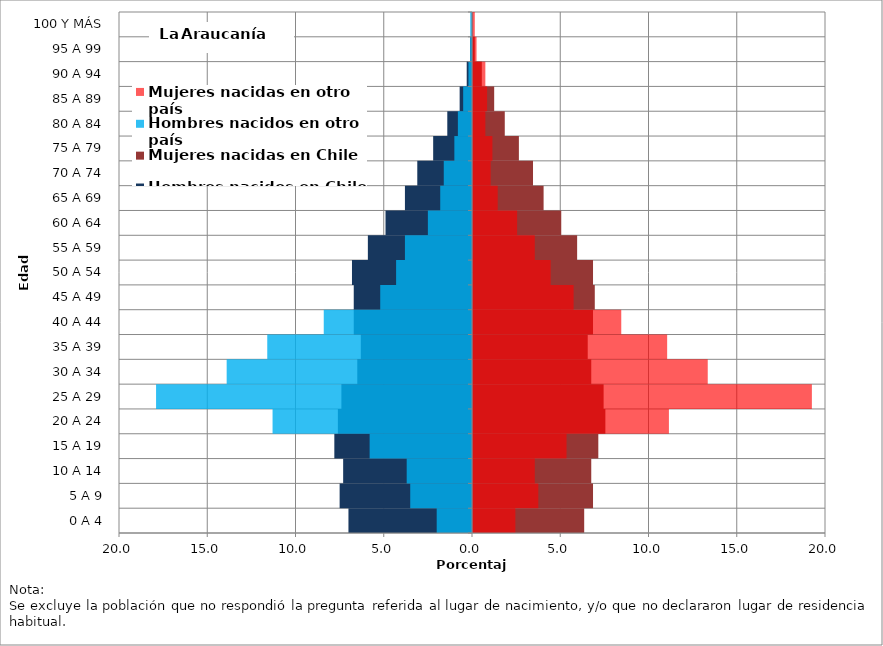
| Category | Hombres nacidos en Chile | Mujeres nacidas en Chile | Hombres nacidos en otro país | Mujeres nacidas en otro país |
|---|---|---|---|---|
| 0 A 4 | -7 | 6.3 | -2 | 2.4 |
| 5 A 9 | -7.5 | 6.8 | -3.5 | 3.7 |
| 10 A 14 | -7.3 | 6.7 | -3.7 | 3.5 |
| 15 A 19 | -7.8 | 7.1 | -5.8 | 5.3 |
| 20 A 24 | -7.6 | 7.5 | -11.3 | 11.1 |
| 25 A 29 | -7.4 | 7.4 | -17.9 | 19.2 |
| 30 A 34 | -6.5 | 6.7 | -13.9 | 13.3 |
| 35 A 39 | -6.3 | 6.5 | -11.6 | 11 |
| 40 A 44 | -6.7 | 6.8 | -8.4 | 8.4 |
| 45 A 49 | -6.7 | 6.9 | -5.2 | 5.7 |
| 50 A 54 | -6.8 | 6.8 | -4.3 | 4.4 |
| 55 A 59 | -5.9 | 5.9 | -3.8 | 3.5 |
| 60 A 64 | -4.9 | 5 | -2.5 | 2.5 |
| 65 A 69 | -3.8 | 4 | -1.8 | 1.4 |
| 70 A 74 | -3.1 | 3.4 | -1.6 | 1 |
| 75 A 79 | -2.2 | 2.6 | -1 | 1.1 |
| 80 A 84 | -1.4 | 1.8 | -0.8 | 0.7 |
| 85 A 89 | -0.7 | 1.2 | -0.5 | 0.8 |
| 90 A 94 | -0.3 | 0.5 | -0.2 | 0.7 |
| 95 A 99 | -0.1 | 0.1 | -0.1 | 0.2 |
| 100 Y MÁS | 0 | 0 | -0.1 | 0.1 |